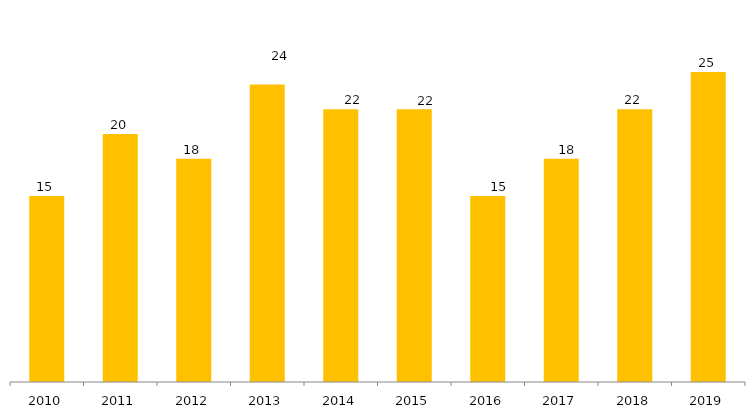
| Category | Grande Área CNPq |
|---|---|
| 2010.0 | 15 |
| 2011.0 | 20 |
| 2012.0 | 18 |
| 2013.0 | 24 |
| 2014.0 | 22 |
| 2015.0 | 22 |
| 2016.0 | 15 |
| 2017.0 | 18 |
| 2018.0 | 22 |
| 2019.0 | 25 |